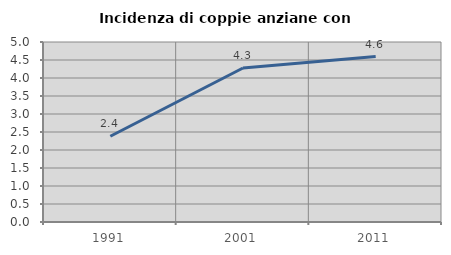
| Category | Incidenza di coppie anziane con figli |
|---|---|
| 1991.0 | 2.381 |
| 2001.0 | 4.277 |
| 2011.0 | 4.595 |